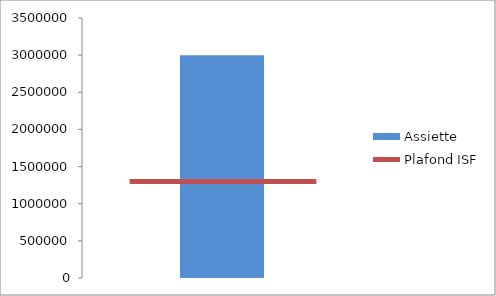
| Category | Assiette |
|---|---|
| 0 | 0 |
| 1 | 3000000 |
| 2 | 0 |